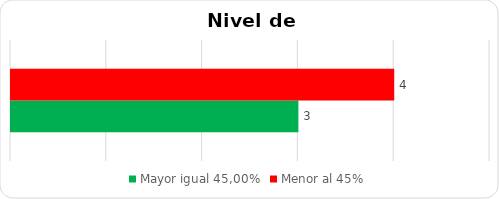
| Category | Mayor igual 45,00% | Menor al 45% |
|---|---|---|
| 0 | 3 | 4 |